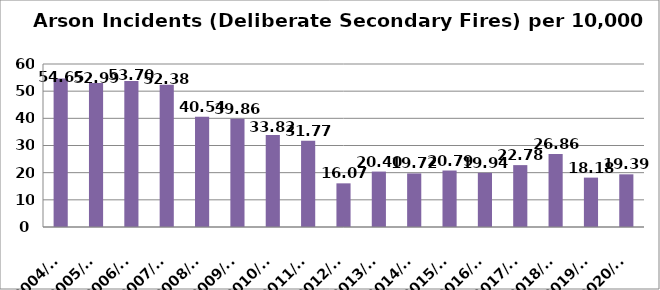
| Category | Series 0 |
|---|---|
| 2004/05 | 54.65 |
| 2005/06 | 52.99 |
| 2006/07 | 53.7 |
| 2007/08 | 52.38 |
| 2008/09 | 40.54 |
| 2009/10 | 39.86 |
| 2010/11 | 33.82 |
| 2011/12 | 31.77 |
| 2012/13 | 16.07 |
| 2013/14 | 20.4 |
| 2014/15 | 19.72 |
| 2015/16 | 20.79 |
| 2016/17 | 19.94 |
| 2017/18 | 22.78 |
| 2018/19 | 26.86 |
| 2019/20 | 18.18 |
| 2020/21 | 19.39 |